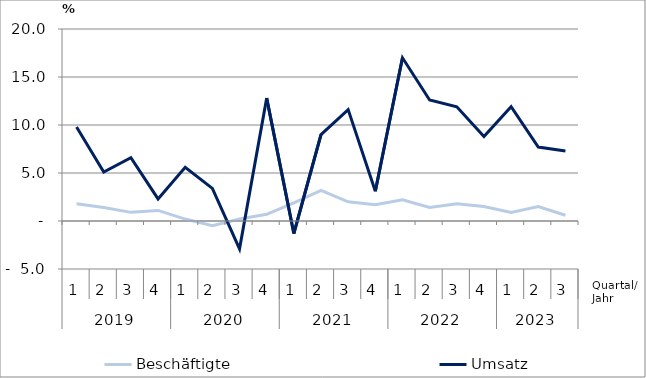
| Category | Beschäftigte | Umsatz |
|---|---|---|
| 0 | 1.8 | 9.8 |
| 1 | 1.4 | 5.1 |
| 2 | 0.9 | 6.6 |
| 3 | 1.1 | 2.3 |
| 4 | 0.2 | 5.6 |
| 5 | -0.5 | 3.4 |
| 6 | 0.2 | -2.9 |
| 7 | 0.7 | 12.8 |
| 8 | 1.9 | -1.3 |
| 9 | 3.2 | 9 |
| 10 | 2 | 11.6 |
| 11 | 1.7 | 3.1 |
| 12 | 2.2 | 17 |
| 13 | 1.4 | 12.6 |
| 14 | 1.8 | 11.9 |
| 15 | 1.5 | 8.8 |
| 16 | 0.9 | 11.9 |
| 17 | 1.5 | 7.7 |
| 18 | 0.6 | 7.3 |